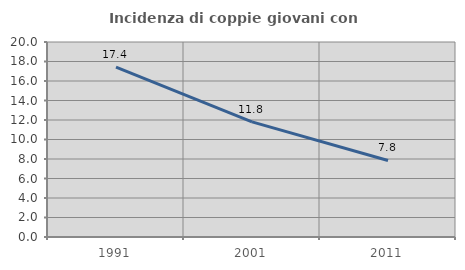
| Category | Incidenza di coppie giovani con figli |
|---|---|
| 1991.0 | 17.43 |
| 2001.0 | 11.813 |
| 2011.0 | 7.849 |